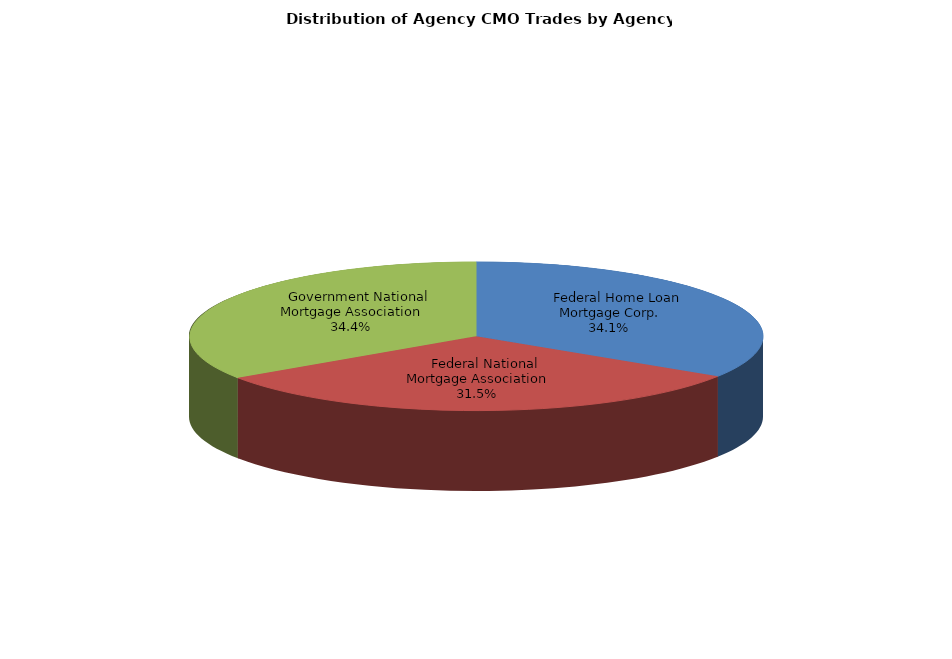
| Category | Series 0 |
|---|---|
|     Federal Home Loan Mortgage Corp. | 414.777 |
|     Federal National Mortgage Association | 383.49 |
|     Government National Mortgage Association | 419.104 |